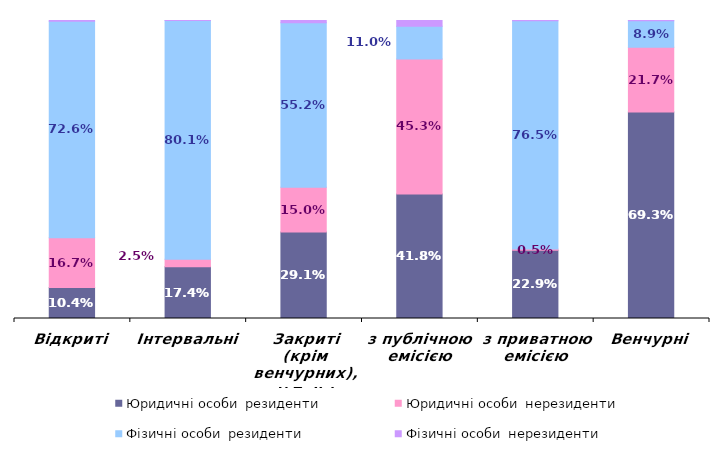
| Category | Юридичні особи  | Фізичні особи  |
|---|---|---|
| Відкриті | 0.167 | 0.002 |
| Інтервальні | 0.025 | 0 |
| Закриті (крім венчурних), у т. ч.: | 0.15 | 0.007 |
| з публічною емісією | 0.453 | 0.02 |
| з приватною емісією | 0.005 | 0.001 |
| Венчурні | 0.217 | 0.001 |